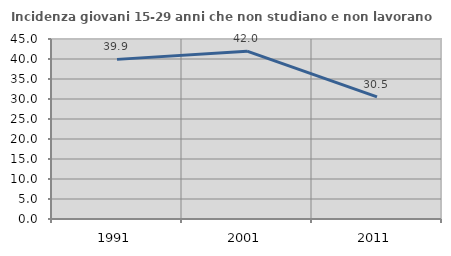
| Category | Incidenza giovani 15-29 anni che non studiano e non lavorano  |
|---|---|
| 1991.0 | 39.906 |
| 2001.0 | 41.958 |
| 2011.0 | 30.526 |